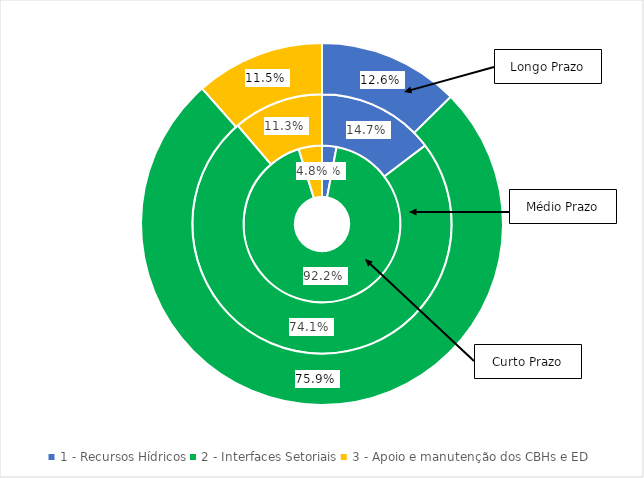
| Category | Curto Prazo (%) | Médio Prazo (%) | Longo Prazo (%) |
|---|---|---|---|
| 1 - Recursos Hídricos | 0.03 | 0.147 | 0.126 |
| 2 - Interfaces Setoriais | 0.922 | 0.741 | 0.759 |
| 3 - Apoio e manutenção dos CBHs e ED | 0.048 | 0.113 | 0.115 |